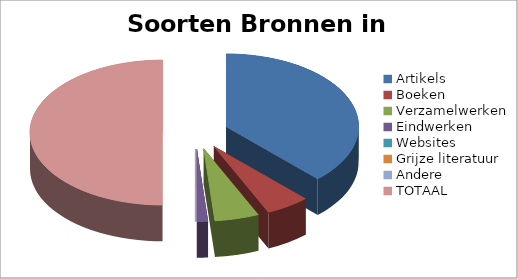
| Category | Procent |
|---|---|
| Artikels | 0.757 |
| Boeken | 0.108 |
| Verzamelwerken | 0.108 |
| Eindwerken | 0.027 |
| Websites | 0 |
| Grijze literatuur | 0 |
| Andere | 0 |
| TOTAAL | 1 |